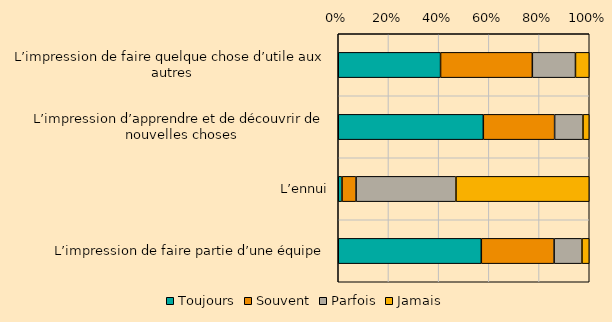
| Category | Toujours | Souvent | Parfois | Jamais |
|---|---|---|---|---|
| L’impression de faire quelque chose d’utile aux autres | 0.408 | 0.366 | 0.172 | 0.055 |
| L’impression d’apprendre et de découvrir de nouvelles choses | 0.578 | 0.284 | 0.113 | 0.025 |
| L’ennui | 0.015 | 0.056 | 0.398 | 0.531 |
| L’impression de faire partie d’une équipe | 0.57 | 0.29 | 0.111 | 0.029 |